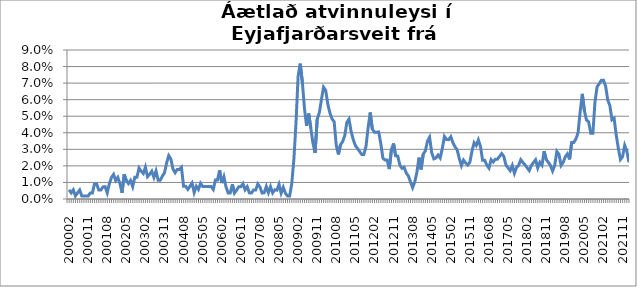
| Category | Series 0 |
|---|---|
| 200002 | 0.006 |
| 200003 | 0.004 |
| 200004 | 0.006 |
| 200005 | 0.002 |
| 200006 | 0.004 |
| 200007 | 0.005 |
| 200008 | 0.002 |
| 200009 | 0.002 |
| 200010 | 0.002 |
| 200011 | 0.002 |
| 200012 | 0.004 |
| 200101 | 0.004 |
| 200102 | 0.009 |
| 200103 | 0.009 |
| 200104 | 0.005 |
| 200105 | 0.005 |
| 200106 | 0.007 |
| 200107 | 0.007 |
| 200108 | 0.004 |
| 200109 | 0.009 |
| 200110 | 0.013 |
| 200111 | 0.015 |
| 200112 | 0.011 |
| 200201 | 0.013 |
| 200202 | 0.009 |
| 200203 | 0.004 |
| 200204 | 0.015 |
| 200205 | 0.011 |
| 200206 | 0.009 |
| 200207 | 0.011 |
| 200208 | 0.007 |
| 200209 | 0.013 |
| 200210 | 0.013 |
| 200211 | 0.019 |
| 200212 | 0.017 |
| 200301 | 0.015 |
| 200302 | 0.019 |
| 200303 | 0.013 |
| 200304 | 0.015 |
| 200305 | 0.017 |
| 200306 | 0.013 |
| 200307 | 0.017 |
| 200308 | 0.011 |
| 200309 | 0.011 |
| 200310 | 0.014 |
| 200311 | 0.016 |
| 200312 | 0.022 |
| 200401 | 0.026 |
| 200402 | 0.024 |
| 200403 | 0.018 |
| 200404 | 0.016 |
| 200405 | 0.018 |
| 200406 | 0.018 |
| 200407 | 0.019 |
| 200408 | 0.008 |
| 200409 | 0.008 |
| 200410 | 0.006 |
| 200411 | 0.008 |
| 200412 | 0.01 |
| 200501 | 0.004 |
| 200502 | 0.008 |
| 200503 | 0.006 |
| 200504 | 0.009 |
| 200505 | 0.008 |
| 200506 | 0.008 |
| 200507 | 0.007 |
| 200508 | 0.007 |
| 200509 | 0.007 |
| 200510 | 0.006 |
| 200511 | 0.012 |
| 200512 | 0.012 |
| 200601 | 0.017 |
| 200602 | 0.01 |
| 200603 | 0.013 |
| 200604 | 0.007 |
| 200605 | 0.004 |
| 200606 | 0.004 |
| 200607 | 0.009 |
| 200608 | 0.004 |
| 200609 | 0.005 |
| 200610 | 0.007 |
| 200611 | 0.007 |
| 200612 | 0.009 |
| 200701 | 0.006 |
| 200702 | 0.007 |
| 200703 | 0.004 |
| 200704 | 0.004 |
| 200705 | 0.005 |
| 200706 | 0.005 |
| 200707 | 0.009 |
| 200708 | 0.007 |
| 200709 | 0.004 |
| 200710 | 0.004 |
| 200711 | 0.008 |
| 200712 | 0.004 |
| 200801 | 0.007 |
| 200802 | 0.004 |
| 200803 | 0.006 |
| 200804 | 0.005 |
| 200805 | 0.009 |
| 200806 | 0.004 |
| 200807 | 0.007 |
| 200808 | 0.004 |
| 200809 | 0.002 |
| 200810 | 0.002 |
| 200811 | 0.009 |
| 200812 | 0.024 |
| 200901 | 0.046 |
| 200902 | 0.074 |
| 200903 | 0.082 |
| 200904 | 0.071 |
| 200905 | 0.055 |
| 200906 | 0.044 |
| 200907 | 0.052 |
| 200908 | 0.043 |
| 200909 | 0.034 |
| 200910 | 0.028 |
| 200911 | 0.048 |
| 200912 | 0.052 |
| 201001 | 0.06 |
| 201002 | 0.068 |
| 201003 | 0.066 |
| 201004 | 0.057 |
| 201005 | 0.052 |
| 201006 | 0.048 |
| 201007 | 0.047 |
| 201008 | 0.032 |
| 201009 | 0.027 |
| 201010 | 0.033 |
| 201011 | 0.035 |
| 201012 | 0.038 |
| 201101 | 0.046 |
| 201102 | 0.048 |
| 201103 | 0.041 |
| 201104 | 0.036 |
| 201105 | 0.032 |
| 201106 | 0.031 |
| 201107 | 0.029 |
| 201108 | 0.027 |
| 201109 | 0.027 |
| 201110 | 0.032 |
| 201111 | 0.043 |
| 201112 | 0.052 |
| 201201 | 0.042 |
| 201202 | 0.04 |
| 201203 | 0.04 |
| 201204 | 0.04 |
| 201205 | 0.033 |
| 201206 | 0.025 |
| 201207 | 0.024 |
| 201208 | 0.024 |
| 201209 | 0.018 |
| 201210 | 0.03 |
| 201211 | 0.034 |
| 201212 | 0.026 |
| 201301 | 0.026 |
| 201302 | 0.02 |
| 201303 | 0.019 |
| 201304 | 0.019 |
| 201305 | 0.016 |
| 201306 | 0.014 |
| 201307 | 0.01 |
| 201308 | 0.007 |
| 201309 | 0.01 |
| 201310 | 0.016 |
| 201311 | 0.025 |
| 201312 | 0.018 |
| 201401 | 0.027 |
| 201402 | 0.029 |
| 201403 | 0.035 |
| 201404 | 0.037 |
| 201405 | 0.028 |
| 201406 | 0.024 |
| 201407 | 0.025 |
| 201408 | 0.027 |
| 201409 | 0.025 |
| 201410 | 0.031 |
| 201411 | 0.038 |
| 201412 | 0.036 |
| 201501 | 0.036 |
| 201502 | 0.038 |
| 201503 | 0.034 |
| 201504 | 0.031 |
| 201505 | 0.03 |
| 201506 | 0.024 |
| 201507 | 0.02 |
| 201508 | 0.023 |
| 201509 | 0.022 |
| 201510 | 0.021 |
| 201511 | 0.022 |
| 201512 | 0.029 |
| 201601 | 0.034 |
| 201602 | 0.032 |
| 201603 | 0.036 |
| 201604 | 0.032 |
| 201605 | 0.023 |
| 201606 | 0.023 |
| 201607 | 0.02 |
| 201608 | 0.019 |
| 201609 | 0.024 |
| 201610 | 0.022 |
| 201611 | 0.024 |
| 201612 | 0.024 |
| 201701 | 0.026 |
| 201702 | 0.027 |
| 201703 | 0.026 |
| 201704 | 0.021 |
| 201705 | 0.019 |
| 201706 | 0.017 |
| 201707 | 0.02 |
| 201708 | 0.016 |
| 201709 | 0.019 |
| 201710 | 0.02 |
| 201711 | 0.024 |
| 201712 | 0.022 |
| 201801 | 0.021 |
| 201802 | 0.019 |
| 201803 | 0.017 |
| 201804 | 0.02 |
| 201805 | 0.022 |
| 201806 | 0.024 |
| 201807 | 0.019 |
| 201808 | 0.022 |
| 201809 | 0.02 |
| 201810 | 0.029 |
| 201811 | 0.024 |
| 201812 | 0.022 |
| 201901 | 0.02 |
| 201902 | 0.017 |
| 201903 | 0.02 |
| 201904 | 0.029 |
| 201905 | 0.027 |
| 201906 | 0.02 |
| 201907 | 0.022 |
| 201908 | 0.026 |
| 201909 | 0.027 |
| 201910 | 0.024 |
| 201911 | 0.034 |
| 201912 | 0.034 |
| 202001 | 0.036 |
| 202002 | 0.04 |
| 202003 | 0.053 |
| 202004 | 0.064 |
| 202005 | 0.053 |
| 202006 | 0.048 |
| 202007 | 0.047 |
| 202008 | 0.04 |
| 202009 | 0.04 |
| 202010 | 0.059 |
| 202011 | 0.068 |
| 202012 | 0.07 |
| 202101 | 0.072 |
| 202102 | 0.072 |
| 202103 | 0.068 |
| 202104 | 0.06 |
| 202105 | 0.056 |
| 202106 | 0.048 |
| 202107 | 0.049 |
| 202108 | 0.039 |
| 202109 | 0.031 |
| 202110 | 0.024 |
| 202111 | 0.026 |
| 202112 | 0.032 |
| 202201 | 0.029 |
| 202202 | 0.022 |